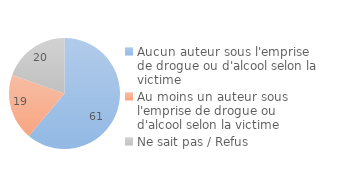
| Category | Series 0 |
|---|---|
| Aucun auteur sous l'emprise de drogue ou d'alcool selon la victime | 61.122 |
| Au moins un auteur sous l'emprise de drogue ou d'alcool selon la victime | 19.294 |
| Ne sait pas / Refus | 19.584 |